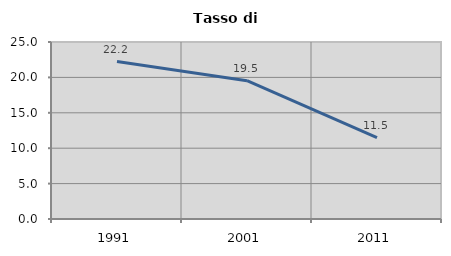
| Category | Tasso di disoccupazione   |
|---|---|
| 1991.0 | 22.245 |
| 2001.0 | 19.531 |
| 2011.0 | 11.51 |